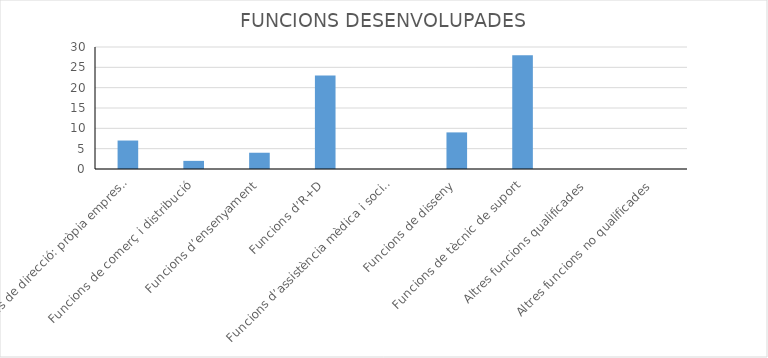
| Category | Series 0 |
|---|---|
| Funcions de direcció: pròpia empresa, direcció, producció, financera, etc. | 7 |
| Funcions de comerç i distribució | 2 |
| Funcions d’ensenyament | 4 |
| Funcions d’R+D | 23 |
| Funcions d’assistència mèdica i social | 0 |
| Funcions de disseny | 9 |
| Funcions de tècnic de suport | 28 |
| Altres funcions qualificades | 0 |
| Altres funcions no qualificades | 0 |